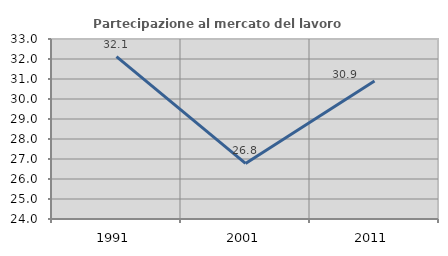
| Category | Partecipazione al mercato del lavoro  femminile |
|---|---|
| 1991.0 | 32.123 |
| 2001.0 | 26.78 |
| 2011.0 | 30.895 |